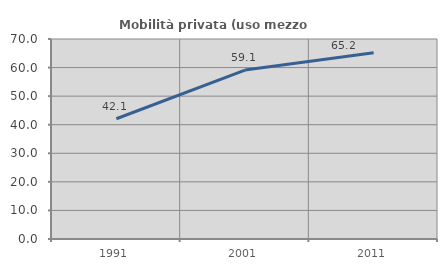
| Category | Mobilità privata (uso mezzo privato) |
|---|---|
| 1991.0 | 42.087 |
| 2001.0 | 59.132 |
| 2011.0 | 65.226 |